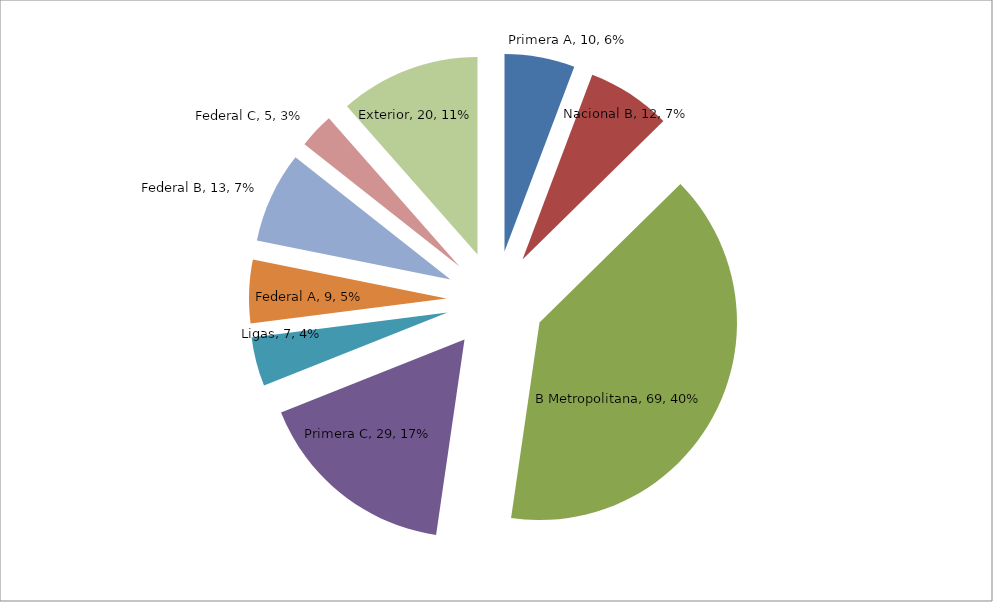
| Category | Series 0 |
|---|---|
| Primera A | 10 |
| Nacional B | 12 |
| B Metropolitana | 69 |
| Primera C | 29 |
| Ligas | 7 |
| Federal A | 9 |
| Federal B | 13 |
| Federal C | 5 |
| Exterior | 20 |